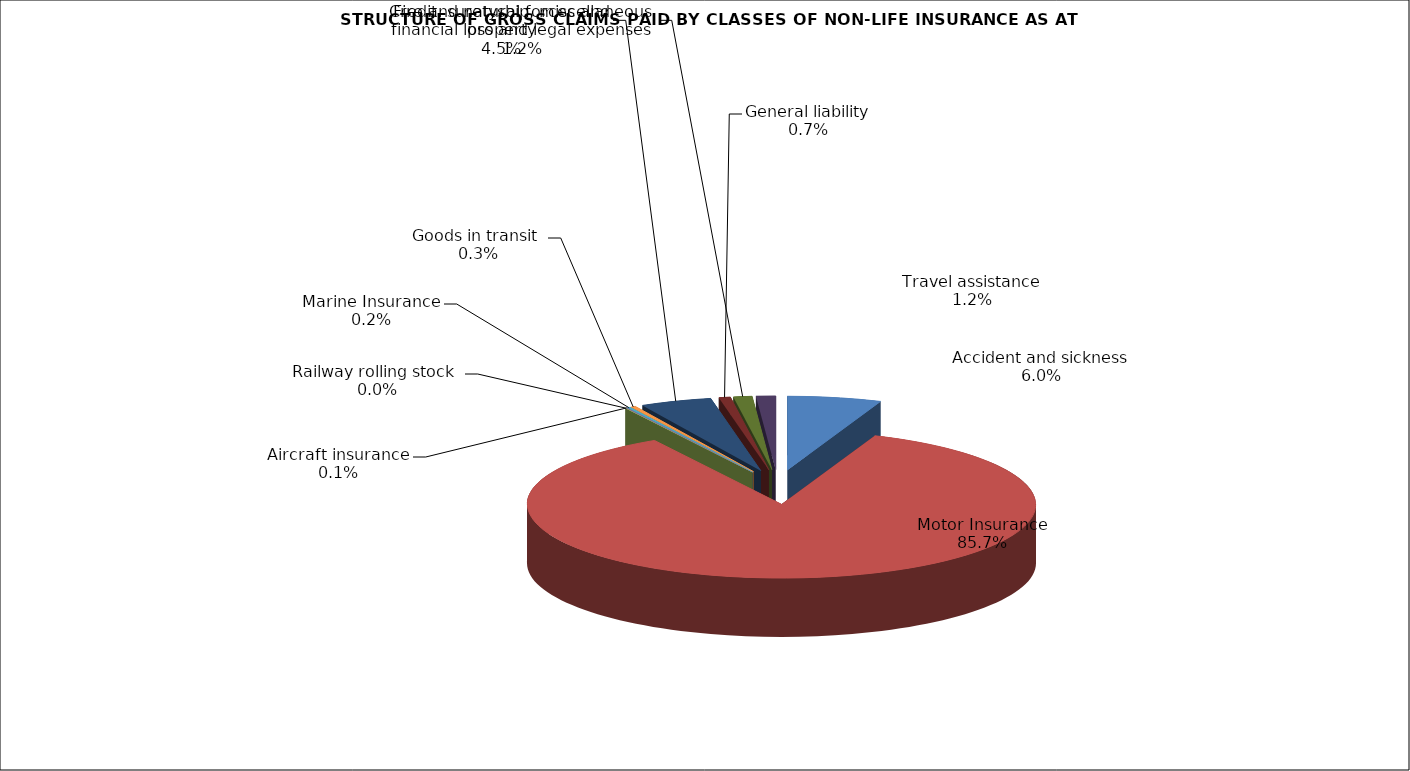
| Category | Accident and sickness |
|---|---|
| Accident and sickness | 0.06 |
| Motor Insurance | 0.857 |
| Railway rolling stock  | 0 |
| Aircraft insurance | 0.001 |
| Marine Insurance | 0.002 |
| Goods in transit  | 0.003 |
| Fire and natural forces and property | 0.045 |
| General liability | 0.007 |
| Credit, suretyship, miscellaneous financial loss and legal expenses | 0.012 |
| Travel assistance | 0.012 |